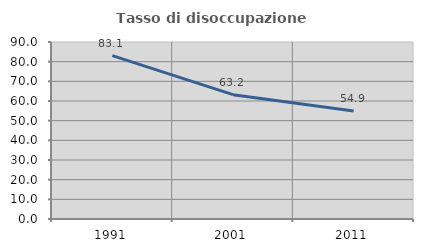
| Category | Tasso di disoccupazione giovanile  |
|---|---|
| 1991.0 | 83.051 |
| 2001.0 | 63.218 |
| 2011.0 | 54.93 |